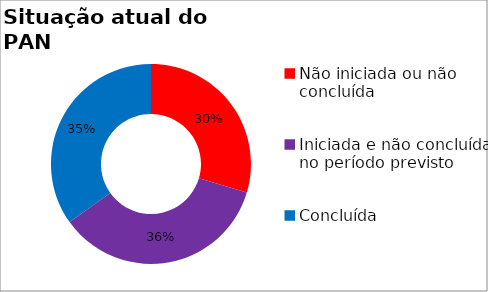
| Category | Series 0 |
|---|---|
| Não iniciada ou não concluída | 0.296 |
| Iniciada e não concluída no período previsto | 0.355 |
| Concluída | 0.349 |